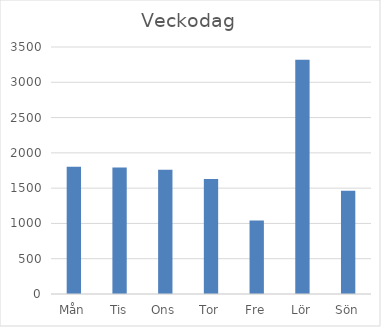
| Category | Summa |
|---|---|
| Mån | 1802 |
| Tis | 1794 |
| Ons | 1762 |
| Tor | 1628 |
| Fre | 1041 |
| Lör | 3321 |
| Sön | 1464 |